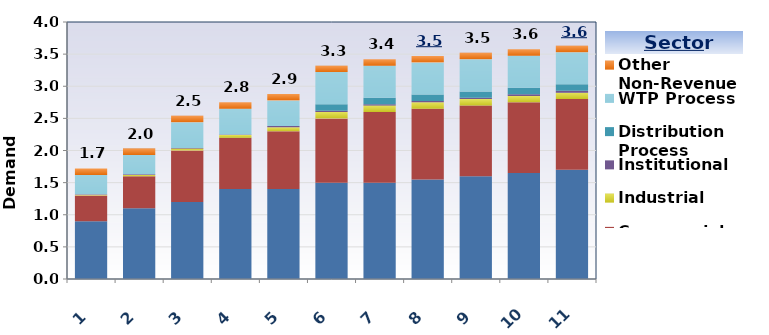
| Category | Residential | Commercial | Industrial | Institutional | Distribution Process | WTP Process | Other Non-Revenue |
|---|---|---|---|---|---|---|---|
| 0 | 0.9 | 0.4 | 0.01 | 0.01 | 0 | 0.3 | 0.1 |
| 1 | 1.1 | 0.5 | 0.02 | 0.01 | 0 | 0.3 | 0.1 |
| 2 | 1.2 | 0.8 | 0.03 | 0.01 | 0 | 0.4 | 0.1 |
| 3 | 1.4 | 0.8 | 0.04 | 0.01 | 0 | 0.4 | 0.1 |
| 4 | 1.4 | 0.9 | 0.06 | 0.02 | 0 | 0.4 | 0.1 |
| 5 | 1.5 | 1 | 0.1 | 0.02 | 0.1 | 0.5 | 0.1 |
| 6 | 1.5 | 1.1 | 0.1 | 0.02 | 0.1 | 0.5 | 0.1 |
| 7 | 1.55 | 1.1 | 0.1 | 0.02 | 0.1 | 0.5 | 0.1 |
| 8 | 1.6 | 1.1 | 0.1 | 0.02 | 0.1 | 0.5 | 0.1 |
| 9 | 1.65 | 1.1 | 0.1 | 0.025 | 0.1 | 0.5 | 0.1 |
| 10 | 1.7 | 1.1 | 0.1 | 0.03 | 0.1 | 0.5 | 0.1 |